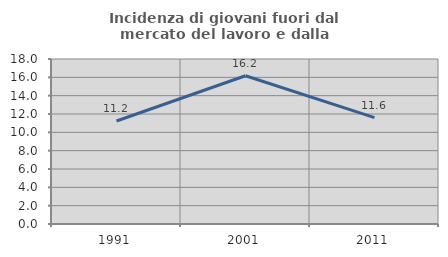
| Category | Incidenza di giovani fuori dal mercato del lavoro e dalla formazione  |
|---|---|
| 1991.0 | 11.237 |
| 2001.0 | 16.169 |
| 2011.0 | 11.602 |